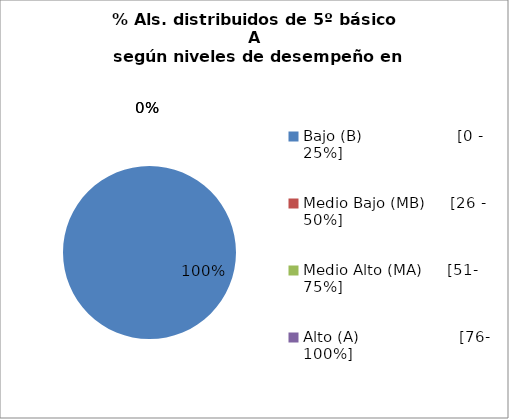
| Category | Series 0 |
|---|---|
| Bajo (B)                   [0 - 25%] | 1 |
| Medio Bajo (MB)     [26 - 50%] | 0 |
| Medio Alto (MA)     [51- 75%] | 0 |
| Alto (A)                    [76- 100%] | 0 |